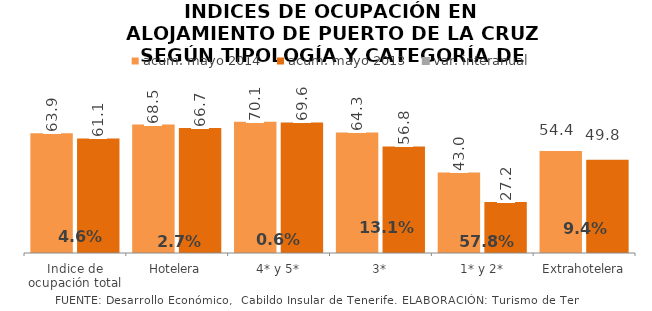
| Category | acum. mayo 2014 | acum. mayo 2013 |
|---|---|---|
| Indice de ocupación total | 63.914 | 61.082 |
| Hotelera | 68.507 | 66.728 |
| 4* y 5* | 70.063 | 69.643 |
| 3* | 64.301 | 56.83 |
| 1* y 2* | 42.951 | 27.211 |
| Extrahotelera | 54.433 | 49.766 |